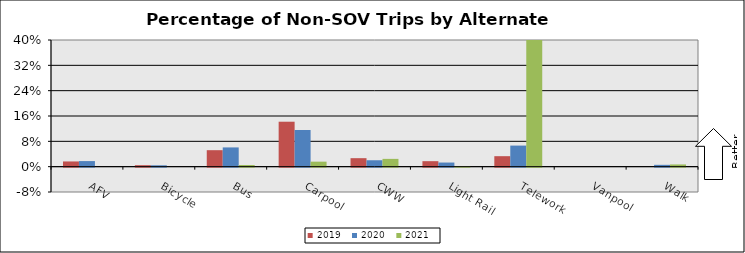
| Category | 2019 | 2020 | 2021 |
|---|---|---|---|
| AFV | 0.016 | 0.018 | 0 |
| Bicycle | 0.005 | 0.004 | 0 |
| Bus | 0.052 | 0.061 | 0.005 |
| Carpool | 0.142 | 0.116 | 0.016 |
| CWW | 0.027 | 0.02 | 0.025 |
| Light Rail | 0.017 | 0.013 | 0.002 |
| Telework | 0.033 | 0.067 | 0.819 |
| Vanpool | 0 | 0 | 0 |
| Walk | 0 | 0.006 | 0.007 |